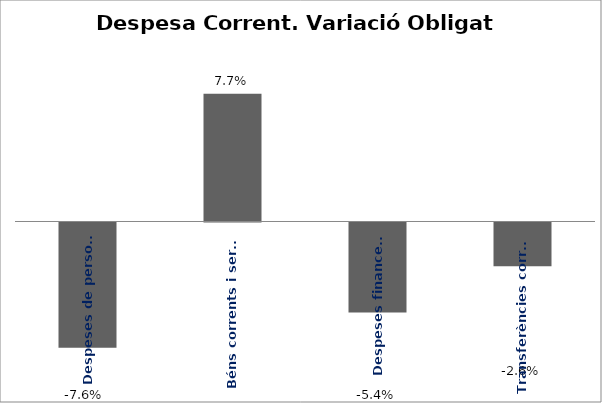
| Category | Series 0 |
|---|---|
| Despeses de personal | -0.076 |
| Béns corrents i serveis | 0.077 |
| Despeses financeres | -0.054 |
| Transferències corrents | -0.026 |